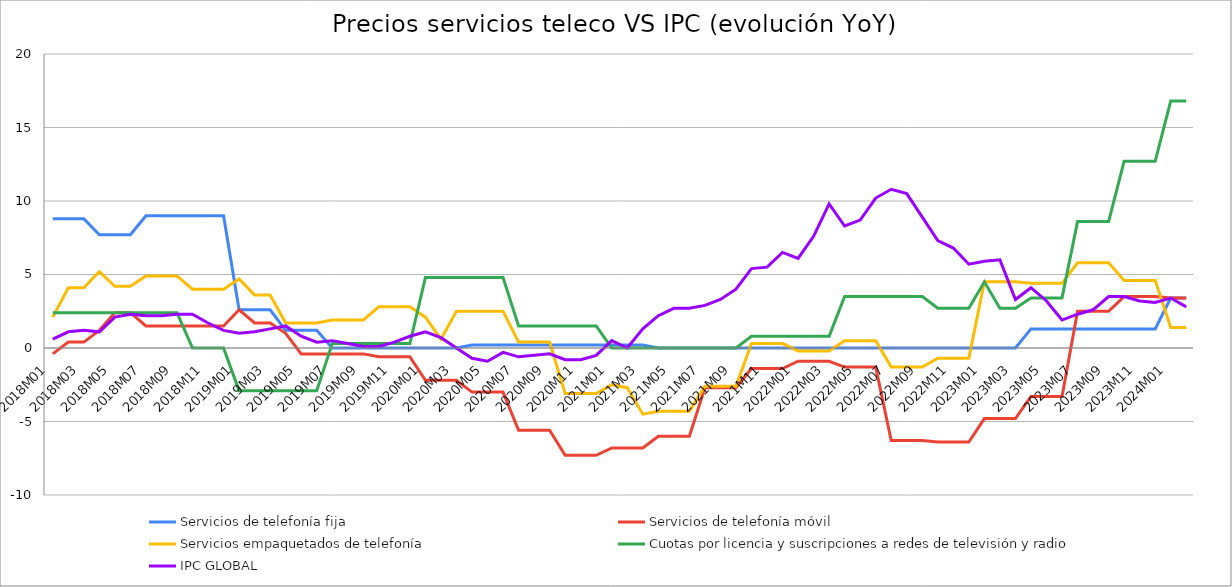
| Category | Servicios de telefonía fija | Servicios de telefonía móvil | Servicios empaquetados de telefonía | Cuotas por licencia y suscripciones a redes de televisión y radio | IPC GLOBAL |
|---|---|---|---|---|---|
| 2018M01 | 8.8 | -0.4 | 2.1 | 2.4 | 0.6 |
| 2018M02 | 8.8 | 0.4 | 4.1 | 2.4 | 1.1 |
| 2018M03 | 8.8 | 0.4 | 4.1 | 2.4 | 1.2 |
| 2018M04 | 7.7 | 1.2 | 5.2 | 2.4 | 1.1 |
| 2018M05 | 7.7 | 2.4 | 4.2 | 2.4 | 2.1 |
| 2018M06 | 7.7 | 2.4 | 4.2 | 2.4 | 2.3 |
| 2018M07 | 9 | 1.5 | 4.9 | 2.4 | 2.2 |
| 2018M08 | 9 | 1.5 | 4.9 | 2.4 | 2.2 |
| 2018M09 | 9 | 1.5 | 4.9 | 2.4 | 2.3 |
| 2018M10 | 9 | 1.5 | 4 | 0 | 2.3 |
| 2018M11 | 9 | 1.5 | 4 | 0 | 1.7 |
| 2018M12 | 9 | 1.5 | 4 | 0 | 1.2 |
| 2019M01 | 2.6 | 2.6 | 4.7 | -2.9 | 1 |
| 2019M02 | 2.6 | 1.7 | 3.6 | -2.9 | 1.1 |
| 2019M03 | 2.6 | 1.7 | 3.6 | -2.9 | 1.3 |
| 2019M04 | 1.2 | 1 | 1.7 | -2.9 | 1.5 |
| 2019M05 | 1.2 | -0.4 | 1.7 | -2.9 | 0.8 |
| 2019M06 | 1.2 | -0.4 | 1.7 | -2.9 | 0.4 |
| 2019M07 | 0 | -0.4 | 1.9 | 0.3 | 0.5 |
| 2019M08 | 0 | -0.4 | 1.9 | 0.3 | 0.3 |
| 2019M09 | 0 | -0.4 | 1.9 | 0.3 | 0.1 |
| 2019M10 | 0 | -0.6 | 2.8 | 0.3 | 0.1 |
| 2019M11 | 0 | -0.6 | 2.8 | 0.3 | 0.4 |
| 2019M12 | 0 | -0.6 | 2.8 | 0.3 | 0.8 |
| 2020M01 | 0 | -2.2 | 2.1 | 4.8 | 1.1 |
| 2020M02 | 0 | -2.2 | 0.6 | 4.8 | 0.7 |
| 2020M03 | 0 | -2.2 | 2.5 | 4.8 | 0 |
| 2020M04 | 0.2 | -3 | 2.5 | 4.8 | -0.7 |
| 2020M05 | 0.2 | -3 | 2.5 | 4.8 | -0.9 |
| 2020M06 | 0.2 | -3 | 2.5 | 4.8 | -0.3 |
| 2020M07 | 0.2 | -5.6 | 0.4 | 1.5 | -0.6 |
| 2020M08 | 0.2 | -5.6 | 0.4 | 1.5 | -0.5 |
| 2020M09 | 0.2 | -5.6 | 0.4 | 1.5 | -0.4 |
| 2020M10 | 0.2 | -7.3 | -3.1 | 1.5 | -0.8 |
| 2020M11 | 0.2 | -7.3 | -3.1 | 1.5 | -0.8 |
| 2020M12 | 0.2 | -7.3 | -3.1 | 1.5 | -0.5 |
| 2021M01 | 0.2 | -6.8 | -2.5 | 0 | 0.5 |
| 2021M02 | 0.2 | -6.8 | -2.7 | 0 | 0 |
| 2021M03 | 0.2 | -6.8 | -4.5 | 0 | 1.3 |
| 2021M04 | 0 | -6 | -4.3 | 0 | 2.2 |
| 2021M05 | 0 | -6 | -4.3 | 0 | 2.7 |
| 2021M06 | 0 | -6 | -4.3 | 0 | 2.7 |
| 2021M07 | 0 | -2.7 | -2.6 | 0 | 2.9 |
| 2021M08 | 0 | -2.7 | -2.6 | 0 | 3.3 |
| 2021M09 | 0 | -2.7 | -2.6 | 0 | 4 |
| 2021M10 | 0 | -1.4 | 0.3 | 0.8 | 5.4 |
| 2021M11 | 0 | -1.4 | 0.3 | 0.8 | 5.5 |
| 2021M12 | 0 | -1.4 | 0.3 | 0.8 | 6.5 |
| 2022M01 | 0 | -0.9 | -0.2 | 0.8 | 6.1 |
| 2022M02 | 0 | -0.9 | -0.2 | 0.8 | 7.6 |
| 2022M03 | 0 | -0.9 | -0.2 | 0.8 | 9.8 |
| 2022M04 | 0 | -1.3 | 0.5 | 3.5 | 8.3 |
| 2022M05 | 0 | -1.3 | 0.5 | 3.5 | 8.7 |
| 2022M06 | 0 | -1.3 | 0.5 | 3.5 | 10.2 |
| 2022M07 | 0 | -6.3 | -1.3 | 3.5 | 10.8 |
| 2022M08 | 0 | -6.3 | -1.3 | 3.5 | 10.5 |
| 2022M09 | 0 | -6.3 | -1.3 | 3.5 | 8.9 |
| 2022M10 | 0 | -6.4 | -0.7 | 2.7 | 7.3 |
| 2022M11 | 0 | -6.4 | -0.7 | 2.7 | 6.8 |
| 2022M12 | 0 | -6.4 | -0.7 | 2.7 | 5.7 |
| 2023M01 | 0 | -4.8 | 4.5 | 4.5 | 5.9 |
| 2023M02 | 0 | -4.8 | 4.5 | 2.7 | 6 |
| 2023M03 | 0 | -4.8 | 4.5 | 2.7 | 3.3 |
| 2023M04 | 1.3 | -3.3 | 4.4 | 3.4 | 4.1 |
| 2023M05 | 1.3 | -3.3 | 4.4 | 3.4 | 3.2 |
| 2023M06 | 1.3 | -3.3 | 4.4 | 3.4 | 1.9 |
| 2023M07 | 1.3 | 2.5 | 5.8 | 8.6 | 2.3 |
| 2023M08 | 1.3 | 2.5 | 5.8 | 8.6 | 2.6 |
| 2023M09 | 1.3 | 2.5 | 5.8 | 8.6 | 3.5 |
| 2023M10 | 1.3 | 3.5 | 4.6 | 12.7 | 3.5 |
| 2023M11 | 1.3 | 3.5 | 4.6 | 12.7 | 3.2 |
| 2023M12 | 1.3 | 3.5 | 4.6 | 12.7 | 3.1 |
| 2024M01 | 3.4 | 3.4 | 1.4 | 16.8 | 3.4 |
| 2024M02 | 3.4 | 3.4 | 1.4 | 16.8 | 2.8 |